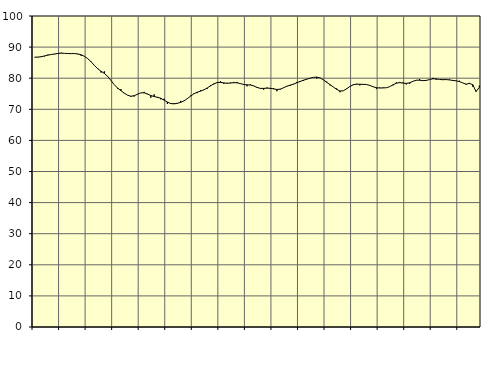
| Category | Piggar | Series 1 |
|---|---|---|
| nan | 86.7 | 86.77 |
| 87.0 | 86.7 | 86.78 |
| 87.0 | 87.1 | 86.91 |
| 87.0 | 87 | 87.17 |
| nan | 87.6 | 87.42 |
| 88.0 | 87.6 | 87.62 |
| 88.0 | 87.7 | 87.79 |
| 88.0 | 88.1 | 87.96 |
| nan | 88.2 | 88.06 |
| 89.0 | 88 | 88 |
| 89.0 | 87.9 | 87.92 |
| 89.0 | 87.9 | 87.91 |
| nan | 88 | 87.92 |
| 90.0 | 87.7 | 87.81 |
| 90.0 | 87.2 | 87.53 |
| 90.0 | 87.1 | 87.04 |
| nan | 86.3 | 86.29 |
| 91.0 | 85.4 | 85.28 |
| 91.0 | 84.2 | 84.11 |
| 91.0 | 83.2 | 83.04 |
| nan | 81.8 | 82.25 |
| 92.0 | 82.2 | 81.54 |
| 92.0 | 80.5 | 80.58 |
| 92.0 | 79.3 | 79.26 |
| nan | 77.9 | 77.9 |
| 93.0 | 76.6 | 76.83 |
| 93.0 | 76.5 | 75.97 |
| 93.0 | 75.1 | 75.21 |
| nan | 74.5 | 74.53 |
| 94.0 | 74 | 74.2 |
| 94.0 | 74.1 | 74.38 |
| 94.0 | 74.9 | 74.85 |
| nan | 75.3 | 75.29 |
| 95.0 | 75.6 | 75.3 |
| 95.0 | 75 | 74.89 |
| 95.0 | 73.7 | 74.44 |
| nan | 74.8 | 74.09 |
| 96.0 | 73.7 | 73.88 |
| 96.0 | 73.2 | 73.54 |
| 96.0 | 73.4 | 72.95 |
| nan | 71.7 | 72.32 |
| 97.0 | 72 | 71.85 |
| 97.0 | 72 | 71.75 |
| 97.0 | 71.8 | 71.94 |
| nan | 72.7 | 72.23 |
| 98.0 | 72.7 | 72.72 |
| 98.0 | 73.5 | 73.42 |
| 98.0 | 74.4 | 74.24 |
| nan | 75.1 | 75.01 |
| 99.0 | 75.2 | 75.5 |
| 99.0 | 76.1 | 75.84 |
| 99.0 | 76.2 | 76.26 |
| nan | 76.6 | 76.86 |
| 0.0 | 77.8 | 77.54 |
| 0.0 | 78 | 78.2 |
| 0.0 | 78.5 | 78.6 |
| nan | 79 | 78.66 |
| 1.0 | 78.2 | 78.5 |
| 1.0 | 78.5 | 78.36 |
| 1.0 | 78.6 | 78.44 |
| nan | 78.8 | 78.56 |
| 2.0 | 78.8 | 78.52 |
| 2.0 | 78.2 | 78.27 |
| 2.0 | 77.9 | 77.98 |
| nan | 77.4 | 77.86 |
| 3.0 | 78 | 77.81 |
| 3.0 | 77.6 | 77.53 |
| 3.0 | 76.9 | 77.03 |
| nan | 76.6 | 76.73 |
| 4.0 | 76.3 | 76.72 |
| 4.0 | 77 | 76.8 |
| 4.0 | 76.6 | 76.76 |
| nan | 76.8 | 76.56 |
| 5.0 | 75.8 | 76.38 |
| 5.0 | 76.3 | 76.48 |
| 5.0 | 76.9 | 76.92 |
| nan | 77.5 | 77.42 |
| 6.0 | 77.5 | 77.76 |
| 6.0 | 78 | 78.1 |
| 6.0 | 78.8 | 78.52 |
| nan | 78.8 | 78.96 |
| 7.0 | 79.1 | 79.35 |
| 7.0 | 79.6 | 79.68 |
| 7.0 | 80 | 80.02 |
| nan | 80.3 | 80.28 |
| 8.0 | 79.9 | 80.35 |
| 8.0 | 80.1 | 80.11 |
| 8.0 | 79.4 | 79.48 |
| nan | 78.9 | 78.7 |
| 9.0 | 77.7 | 77.92 |
| 9.0 | 77.2 | 77.18 |
| 9.0 | 76.7 | 76.42 |
| nan | 75.5 | 75.88 |
| 10.0 | 75.9 | 75.94 |
| 10.0 | 76.7 | 76.58 |
| 10.0 | 77.4 | 77.35 |
| nan | 78 | 77.88 |
| 11.0 | 78.2 | 78.07 |
| 11.0 | 77.7 | 78.06 |
| 11.0 | 78.1 | 78.01 |
| nan | 78 | 77.96 |
| 12.0 | 77.6 | 77.68 |
| 12.0 | 77.2 | 77.24 |
| 12.0 | 76.5 | 76.94 |
| nan | 77 | 76.84 |
| 13.0 | 77 | 76.87 |
| 13.0 | 76.9 | 76.94 |
| 13.0 | 77.3 | 77.29 |
| nan | 77.7 | 77.89 |
| 14.0 | 78.7 | 78.39 |
| 14.0 | 78.8 | 78.58 |
| 14.0 | 78.6 | 78.43 |
| nan | 78 | 78.32 |
| 15.0 | 78.2 | 78.53 |
| 15.0 | 79 | 79 |
| 15.0 | 79.3 | 79.36 |
| nan | 79.7 | 79.35 |
| 16.0 | 79.2 | 79.22 |
| 16.0 | 79.2 | 79.29 |
| 16.0 | 79.6 | 79.56 |
| nan | 80.1 | 79.81 |
| 17.0 | 79.5 | 79.78 |
| 17.0 | 79.6 | 79.59 |
| 17.0 | 79.4 | 79.53 |
| nan | 79.5 | 79.56 |
| 18.0 | 79.6 | 79.44 |
| 18.0 | 79.1 | 79.28 |
| 18.0 | 79.1 | 79.16 |
| nan | 79.2 | 78.9 |
| 19.0 | 78.5 | 78.49 |
| 19.0 | 77.9 | 78.07 |
| 19.0 | 78.5 | 78.3 |
| nan | 77.3 | 77.94 |
| 20.0 | 75.9 | 75.72 |
| 20.0 | 77.6 | 77.03 |